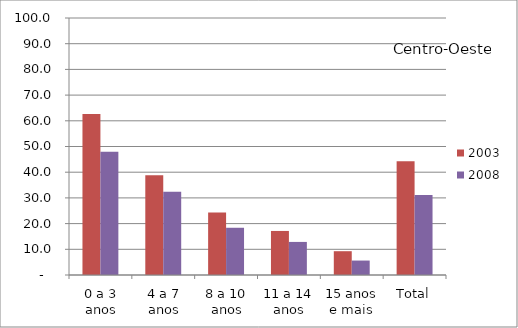
| Category | 2003 | 2008 |
|---|---|---|
| 0 a 3 anos | 62.64 | 47.92 |
| 4 a 7 anos | 38.81 | 32.35 |
| 8 a 10 anos | 24.3 | 18.38 |
| 11 a 14 anos | 17.14 | 12.87 |
| 15 anos e mais | 9.26 | 5.62 |
| Total | 44.22 | 31.14 |